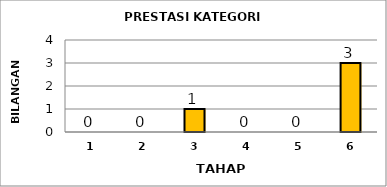
| Category | Series 0 |
|---|---|
| 1.0 | 0 |
| 2.0 | 0 |
| 3.0 | 1 |
| 4.0 | 0 |
| 5.0 | 0 |
| 6.0 | 3 |